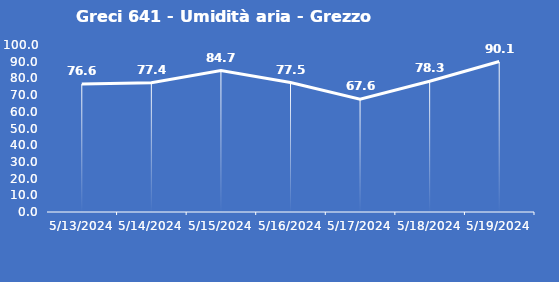
| Category | Greci 641 - Umidità aria - Grezzo (%) |
|---|---|
| 5/13/24 | 76.6 |
| 5/14/24 | 77.4 |
| 5/15/24 | 84.7 |
| 5/16/24 | 77.5 |
| 5/17/24 | 67.6 |
| 5/18/24 | 78.3 |
| 5/19/24 | 90.1 |